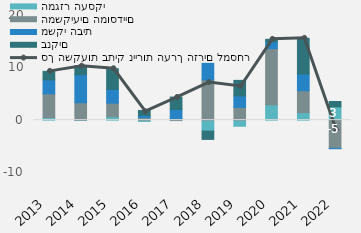
| Category | המגזר העסקי | המשקיעים המוסדיים | משקי הבית | בנקים |
|---|---|---|---|---|
| 2013 | 501.207 | 4538.498 | 2661.819 | 1623.823 |
| 2014 | -63.975 | 3329.657 | 5356.57 | 1689.324 |
| 2015 | 659.06 | 2588.14 | 2643.585 | 3935.124 |
| 2016 | -238.698 | 476.343 | 427.167 | 949.824 |
| 2017 | 240.798 | -80.117 | 1824.021 | 2347.767 |
| 2018 | -2094.607 | 7681.841 | 3176.694 | -1582.31 |
| 2019 | -1161.569 | 2442.763 | 2192.252 | 2965.848 |
| 2020 | 2936.22 | 10742.268 | 1283.747 | 484.501 |
| 2021 | 1438.718 | 4178.212 | 3212.266 | 6807.148 |
| 2022 | 2549 | -5380 | -76 | 1023 |